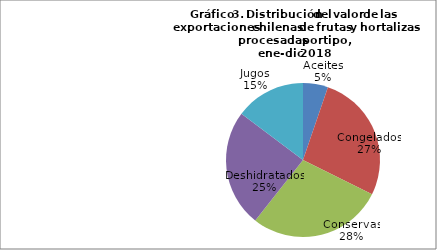
| Category | Series 0 |
|---|---|
| Aceites | 82419499.23 |
| Congelados | 425514297.83 |
| Conservas | 445279186.19 |
| Deshidratados | 386689203.93 |
| Jugos | 231798402.51 |